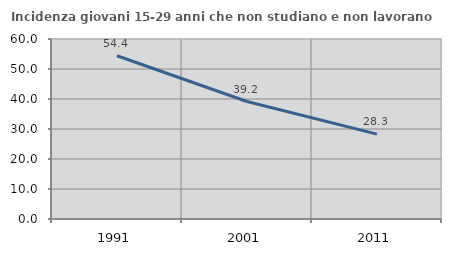
| Category | Incidenza giovani 15-29 anni che non studiano e non lavorano  |
|---|---|
| 1991.0 | 54.404 |
| 2001.0 | 39.158 |
| 2011.0 | 28.295 |